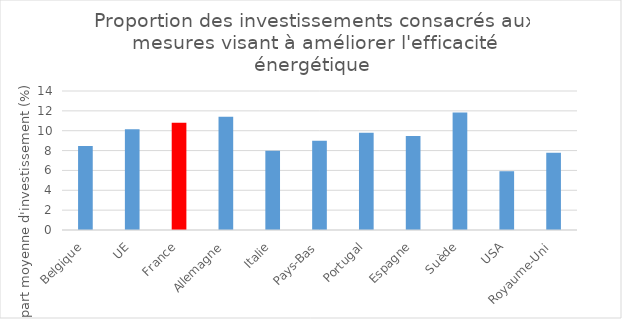
| Category | Proportion des investissements consacrés aux mesures visant à améliorer l'efficacité énergétique |
|---|---|
|   Belgique | 8.45 |
|   UE | 10.16 |
|   France | 10.8 |
|   Allemagne | 11.41 |
|   Italie | 7.98 |
|   Pays-Bas | 8.98 |
|   Portugal | 9.79 |
|   Espagne | 9.48 |
|   Suède | 11.84 |
|   USA | 5.92 |
| Royaume-Uni | 7.78 |